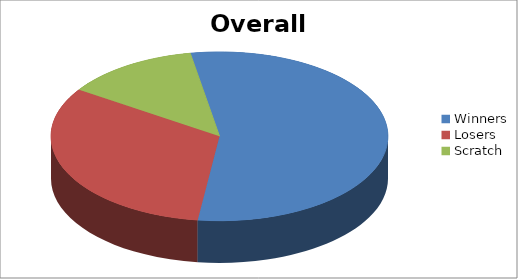
| Category | Series 1 |
|---|---|
| Winners | 17 |
| Losers | 10 |
| Scratch | 4 |